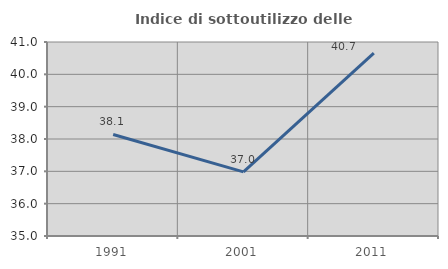
| Category | Indice di sottoutilizzo delle abitazioni  |
|---|---|
| 1991.0 | 38.141 |
| 2001.0 | 36.984 |
| 2011.0 | 40.656 |